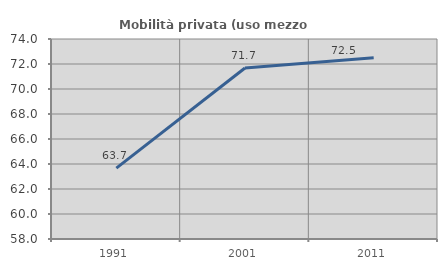
| Category | Mobilità privata (uso mezzo privato) |
|---|---|
| 1991.0 | 63.672 |
| 2001.0 | 71.681 |
| 2011.0 | 72.501 |